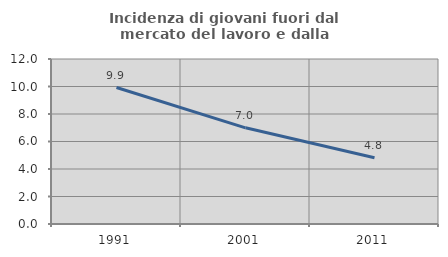
| Category | Incidenza di giovani fuori dal mercato del lavoro e dalla formazione  |
|---|---|
| 1991.0 | 9.927 |
| 2001.0 | 6.995 |
| 2011.0 | 4.821 |